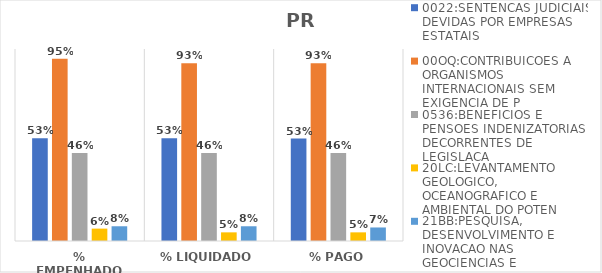
| Category | 0022:SENTENCAS JUDICIAIS DEVIDAS POR EMPRESAS ESTATAIS | 00OQ:CONTRIBUICOES A ORGANISMOS INTERNACIONAIS SEM EXIGENCIA DE P | 0536:BENEFICIOS E PENSOES INDENIZATORIAS DECORRENTES DE LEGISLACA | 20LC:LEVANTAMENTO GEOLOGICO, OCEANOGRAFICO E AMBIENTAL DO POTEN | 21BB:PESQUISA, DESENVOLVIMENTO E INOVACAO NAS GEOCIENCIAS E |
|---|---|---|---|---|---|
| % EMPENHADO | 0.535 | 0.95 | 0.459 | 0.065 | 0.077 |
| % LIQUIDADO | 0.535 | 0.926 | 0.459 | 0.045 | 0.077 |
| % PAGO | 0.533 | 0.926 | 0.459 | 0.045 | 0.07 |